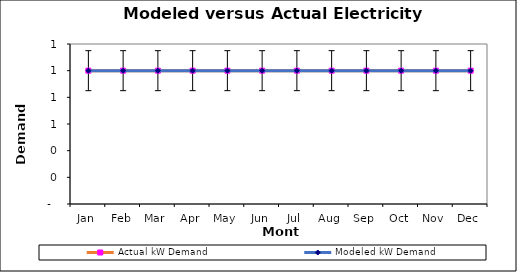
| Category | Actual kW Demand | Modeled kW Demand |
|---|---|---|
| 0 | 1 | 1 |
| 1900-01-01 | 1 | 1 |
| 1900-01-02 | 1 | 1 |
| 1900-01-03 | 1 | 1 |
| 1900-01-04 | 1 | 1 |
| 1900-01-05 | 1 | 1 |
| 1900-01-06 | 1 | 1 |
| 1900-01-07 | 1 | 1 |
| 1900-01-08 | 1 | 1 |
| 1900-01-09 | 1 | 1 |
| 1900-01-10 | 1 | 1 |
| 1900-01-11 | 1 | 1 |